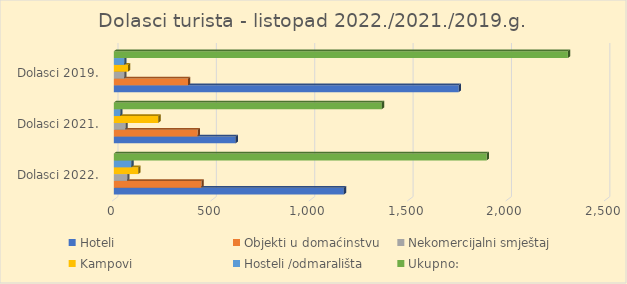
| Category | Hoteli | Objekti u domaćinstvu | Nekomercijalni smještaj | Kampovi | Hosteli /odmarališta | Ukupno: |
|---|---|---|---|---|---|---|
| Dolasci 2022. | 1169 | 445 | 68 | 124 | 89 | 1895 |
| Dolasci 2021. | 619 | 426 | 59 | 226 | 32 | 1362 |
| Dolasci 2019. | 1753 | 377 | 53 | 72 | 53 | 2308 |